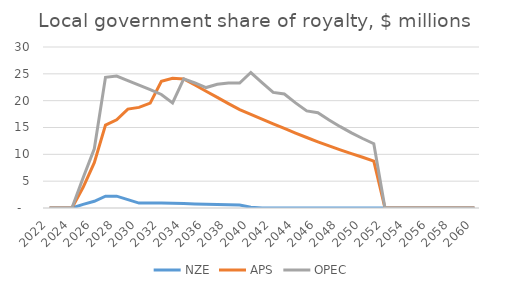
| Category | NZE | APS | OPEC |
|---|---|---|---|
| 2022.0 | 0 | 0 | 0 |
| 2023.0 | 0 | 0 | 0 |
| 2024.0 | 0 | 0 | 0 |
| 2025.0 | 0.671 | 3.86 | 5.64 |
| 2026.0 | 1.246 | 8.458 | 11.038 |
| 2027.0 | 2.202 | 15.452 | 24.356 |
| 2028.0 | 2.202 | 16.443 | 24.586 |
| 2029.0 | 1.559 | 18.429 | 23.726 |
| 2030.0 | 0.913 | 18.752 | 22.886 |
| 2031.0 | 0.912 | 19.546 | 22.067 |
| 2032.0 | 0.909 | 23.604 | 21.157 |
| 2033.0 | 0.873 | 24.164 | 19.578 |
| 2034.0 | 0.82 | 24.052 | 24.052 |
| 2035.0 | 0.755 | 22.916 | 23.295 |
| 2036.0 | 0.697 | 21.762 | 22.442 |
| 2037.0 | 0.642 | 20.605 | 23.052 |
| 2038.0 | 0.592 | 19.459 | 23.309 |
| 2039.0 | 0.545 | 18.334 | 23.28 |
| 2040.0 | 0.148 | 17.459 | 25.245 |
| 2041.0 | 0 | 16.576 | 23.356 |
| 2042.0 | 0 | 15.693 | 21.543 |
| 2043.0 | 0 | 14.822 | 21.234 |
| 2044.0 | 0 | 13.969 | 19.594 |
| 2045.0 | 0 | 13.139 | 18.084 |
| 2046.0 | 0 | 12.337 | 17.766 |
| 2047.0 | 0 | 11.567 | 16.406 |
| 2048.0 | 0 | 10.829 | 15.156 |
| 2049.0 | 0 | 10.126 | 14.005 |
| 2050.0 | 0 | 9.458 | 12.947 |
| 2051.0 | 0 | 8.747 | 11.973 |
| 2052.0 | 0 | 0 | 0 |
| 2053.0 | 0 | 0 | 0 |
| 2054.0 | 0 | 0 | 0 |
| 2055.0 | 0 | 0 | 0 |
| 2056.0 | 0 | 0 | 0 |
| 2057.0 | 0 | 0 | 0 |
| 2058.0 | 0 | 0 | 0 |
| 2059.0 | 0 | 0 | 0 |
| 2060.0 | 0 | 0 | 0 |